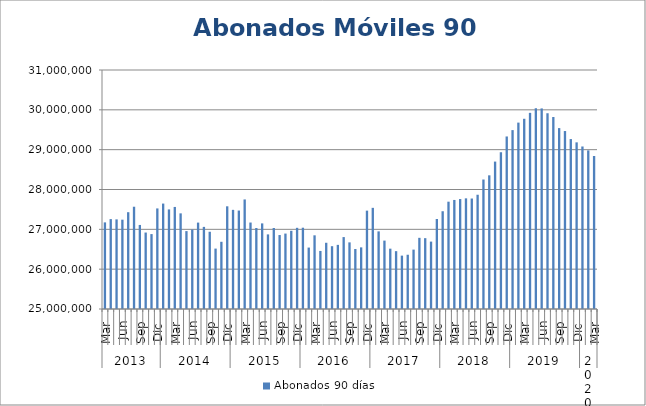
| Category | Abonados 90 días  |
|---|---|
| 0 | 27174429 |
| 1 | 27256799 |
| 2 | 27249896 |
| 3 | 27242396 |
| 4 | 27430194 |
| 5 | 27567464 |
| 6 | 27110010 |
| 7 | 26919316 |
| 8 | 26880609 |
| 9 | 27524963 |
| 10 | 27646717 |
| 11 | 27499992 |
| 12 | 27562088 |
| 13 | 27401040 |
| 14 | 26955717 |
| 15 | 26994609 |
| 16 | 27169188 |
| 17 | 27061687 |
| 18 | 26939071 |
| 19 | 26516500 |
| 20 | 26687326 |
| 21 | 27578143 |
| 22 | 27489223 |
| 23 | 27471553 |
| 24 | 27750473 |
| 25 | 27170692 |
| 26 | 27033211 |
| 27 | 27149172 |
| 28 | 26872979 |
| 29 | 27034173 |
| 30 | 26856662 |
| 31 | 26893632 |
| 32 | 26963755 |
| 33 | 27037951 |
| 34 | 27040824 |
| 35 | 26542149 |
| 36 | 26849710 |
| 37 | 26457447 |
| 38 | 26662676 |
| 39 | 26576782 |
| 40 | 26610099 |
| 41 | 26805521 |
| 42 | 26672717 |
| 43 | 26505805 |
| 44 | 26547173 |
| 45 | 27469211 |
| 46 | 27539556 |
| 47 | 26948853 |
| 48 | 26717067 |
| 49 | 26514588 |
| 50 | 26452370 |
| 51 | 26339907 |
| 52 | 26362130 |
| 53 | 26490787 |
| 54 | 26786764 |
| 55 | 26778405 |
| 56 | 26691976 |
| 57 | 27260107 |
| 58 | 27454349 |
| 59 | 27694179 |
| 60 | 27737550 |
| 61 | 27760296 |
| 62 | 27777818 |
| 63 | 27773600 |
| 64 | 27868225 |
| 65 | 28250702 |
| 66 | 28355724 |
| 67 | 28700770 |
| 68 | 28935345 |
| 69 | 29331337 |
| 70 | 29491024 |
| 71 | 29679237 |
| 72 | 29775295 |
| 73 | 29924167 |
| 74 | 30039747 |
| 75 | 30035533 |
| 76 | 29914508 |
| 77 | 29819526 |
| 78 | 29541515 |
| 79 | 29467889 |
| 80 | 29266254 |
| 81 | 29183632 |
| 82 | 29079792 |
| 83 | 28981844 |
| 84 | 28841431 |